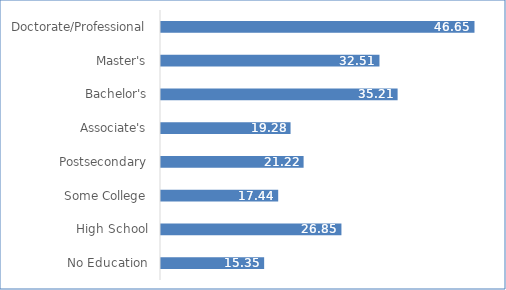
| Category | Series 0 |
|---|---|
| No Education | 15.35 |
| High School | 26.85 |
| Some College | 17.44 |
| Postsecondary | 21.22 |
| Associate's | 19.28 |
| Bachelor's | 35.21 |
| Master's | 32.51 |
| Doctorate/Professional | 46.65 |